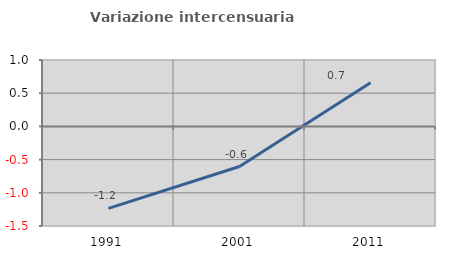
| Category | Variazione intercensuaria annua |
|---|---|
| 1991.0 | -1.235 |
| 2001.0 | -0.604 |
| 2011.0 | 0.657 |